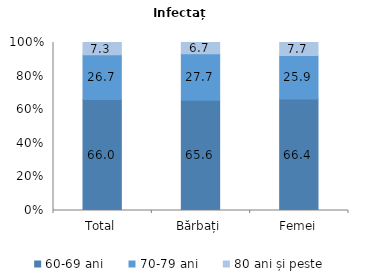
| Category | 60-69 ani | 70-79 ani | 80 ani și peste |
|---|---|---|---|
| Total | 66 | 26.7 | 7.3 |
| Bărbați | 65.6 | 27.7 | 6.7 |
| Femei | 66.4 | 25.9 | 7.7 |